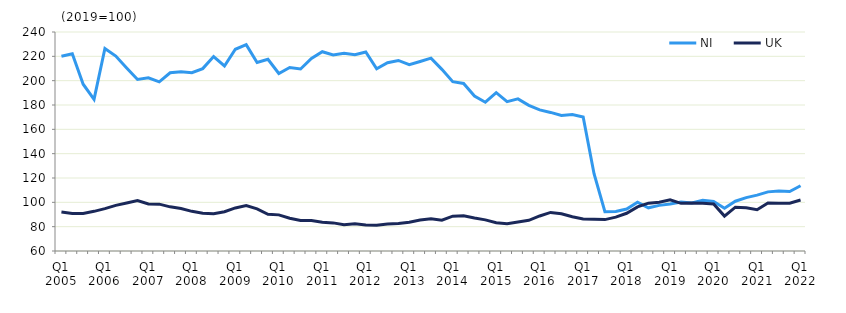
| Category | NI | UK  |
|---|---|---|
| Q1 2005 | 220 | 92 |
|  | 222.1 | 90.8 |
| Q3 2005 | 197.1 | 90.9 |
|  | 184.7 | 92.6 |
| Q1 2006 | 226.4 | 94.8 |
|  | 220.2 | 97.5 |
| Q3 2006 | 210.5 | 99.5 |
|  | 201 | 101.5 |
| Q1 2007 | 202.3 | 98.7 |
|  | 199 | 98.5 |
| Q3 2007 | 206.5 | 96.3 |
|  | 207.3 | 94.9 |
| Q1 2008 | 206.5 | 92.6 |
|  | 209.9 | 91 |
| Q3 2008 | 219.8 | 90.6 |
|  | 212.1 | 92.3 |
| Q1 2009 | 225.8 | 95.4 |
|  | 229.6 | 97.3 |
| Q3 2009 | 214.9 | 94.6 |
|  | 217.6 | 90.2 |
| Q1 2010 | 205.9 | 89.7 |
|  | 210.8 | 86.9 |
| Q3 2010 | 209.6 | 85 |
|  | 218.2 | 85.1 |
| Q1 2011 | 223.8 | 83.7 |
|  | 221.1 | 83.1 |
| Q3 2011 | 222.6 | 81.5 |
|  | 221.3 | 82.3 |
| Q1 2012 | 223.6 | 81.3 |
|  | 209.7 | 81.2 |
| Q3 2012 | 214.8 | 82.2 |
|  | 216.6 | 82.7 |
| Q1 2013 | 213.1 | 83.7 |
|  | 215.8 | 85.5 |
| Q3 2013 | 218.5 | 86.4 |
|  | 209.3 | 85.3 |
| Q1 2014 | 199.2 | 88.6 |
|  | 197.7 | 88.9 |
| Q3 2014 | 187.4 | 87.1 |
|  | 182.3 | 85.6 |
| Q1 2015 | 190.1 | 83.3 |
|  | 182.8 | 82.5 |
| Q3 2015 | 185 | 83.9 |
|  | 179.7 | 85.2 |
| Q1 2016 | 176 | 88.8 |
|  | 173.9 | 91.7 |
| Q3 2016 | 171.4 | 90.6 |
|  | 172.2 | 88.1 |
| Q1 2017 | 170.1 | 86.4 |
|  | 123.5 | 86.1 |
| Q3 2017 | 92.3 | 85.8 |
|  | 92.5 | 87.8 |
| Q1 2018 | 94.5 | 91 |
|  | 100.1 | 96.2 |
| Q3 2018 | 95.5 | 99.3 |
|  | 97.5 | 100.1 |
| Q1 2019 | 98.6 | 102.1 |
|  | 100.2 | 99.2 |
| Q3 2019 | 99.5 | 99.5 |
|  | 101.7 | 99.2 |
| Q1 2020 | 100.7 | 98.7 |
|  | 95.2 | 88.7 |
| Q3 2020 | 100.9 | 96 |
|  | 103.9 | 95.5 |
| Q1 2021 | 105.9 | 93.9 |
|  | 108.6 | 99.5 |
| Q3 2021 | 109.4 | 99.3 |
|  | 108.9 | 99.3 |
| Q1 2022 | 113.6 | 101.9 |